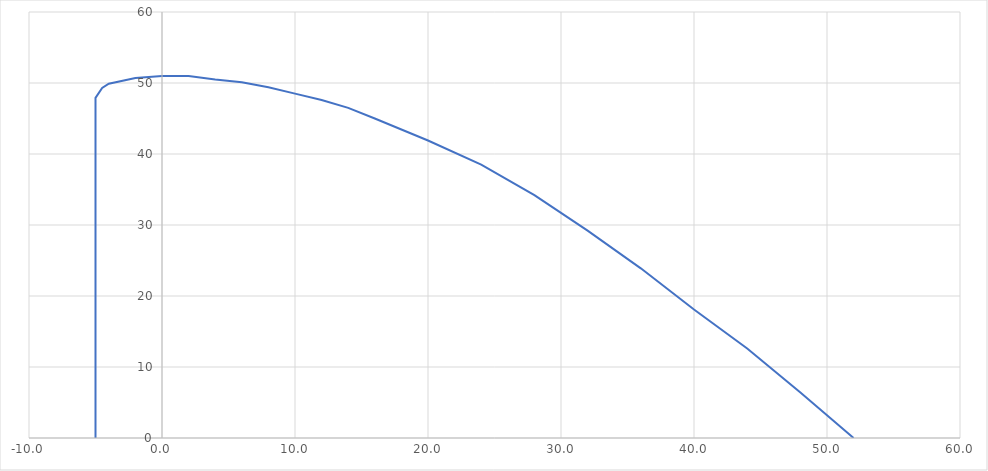
| Category | Series 0 |
|---|---|
| -5.0 | 0 |
| -5.0 | 47.9 |
| -4.5 | 49.3 |
| -4.0 | 49.9 |
| -2.0 | 50.7 |
| 0.0 | 51 |
| 2.0 | 51 |
| 4.0 | 50.5 |
| 6.0 | 50.1 |
| 8.0 | 49.4 |
| 10.0 | 48.5 |
| 12.0 | 47.6 |
| 14.0 | 46.5 |
| 16.0 | 45 |
| 20.0 | 41.9 |
| 24.0 | 38.5 |
| 28.0 | 34.2 |
| 32.0 | 29.2 |
| 36.0 | 23.9 |
| 40.0 | 18.1 |
| 44.0 | 12.6 |
| 48.0 | 6.4 |
| 52.0 | 0 |